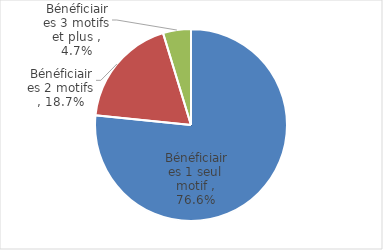
| Category | Part parmi les bénéficiaires d'IMP |
|---|---|
| Bénéficiaires 1 seul motif | 0.766 |
| Bénéficiaires 2 motifs | 0.187 |
| Bénéficiaires 3 motifs et plus | 0.047 |